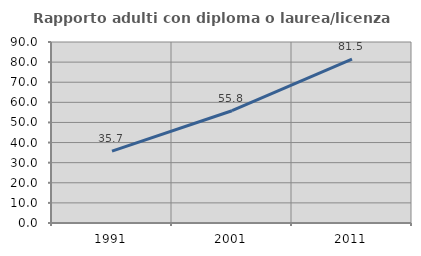
| Category | Rapporto adulti con diploma o laurea/licenza media  |
|---|---|
| 1991.0 | 35.714 |
| 2001.0 | 55.83 |
| 2011.0 | 81.495 |